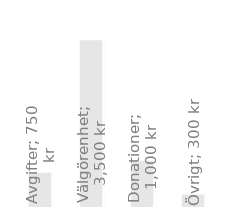
| Category | Årsintäkter: |
|---|---|
| Avgifter | 750 |
| Välgörenhet | 3500 |
| Donationer | 1000 |
| Övrigt | 300 |